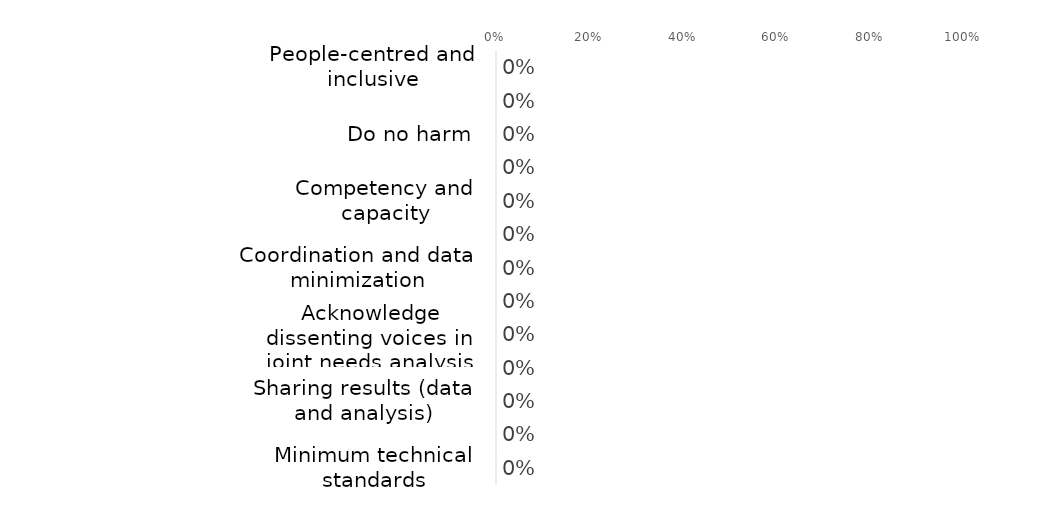
| Category | Series 0 |
|---|---|
| People-centred and inclusive | 0 |
| Accountability to Affected Populations | 0 |
| Do no harm | 0 |
| Designed with a purpose | 0 |
| Competency and capacity | 0 |
| Impartiality | 0 |
| Coordination and data minimization | 0 |
| Joint analysis | 0 |
| Acknowledge dissenting voices in joint needs analysis | 0 |
| Informed consent, confidentiality and data security | 0 |
| Sharing results (data and analysis) | 0 |
| Transparency between actors | 0 |
| Minimum technical standards | 0 |